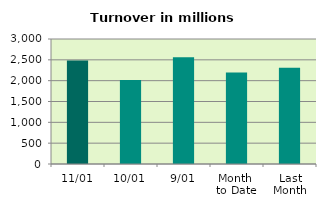
| Category | Series 0 |
|---|---|
| 11/01 | 2485.619 |
| 10/01 | 2017.24 |
| 9/01 | 2562.509 |
| Month 
to Date | 2196.893 |
| Last
Month | 2310.602 |